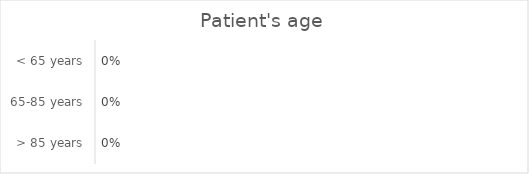
| Category | Series 0 |
|---|---|
| < 65 years | 0 |
| 65-85 years | 0 |
| > 85 years | 0 |